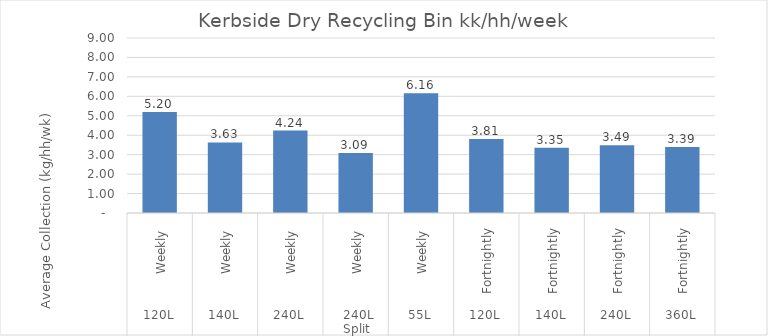
| Category |  kg/hh/wk  |
|---|---|
| 0 | 5.197 |
| 1 | 3.63 |
| 2 | 4.241 |
| 3 | 3.091 |
| 4 | 6.157 |
| 5 | 3.806 |
| 6 | 3.352 |
| 7 | 3.49 |
| 8 | 3.391 |